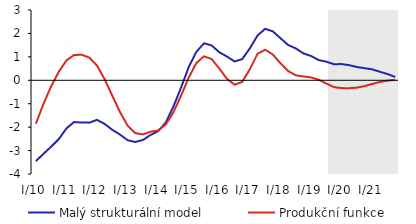
| Category | Malý strukturální model | Produkční funkce |
|---|---|---|
| I/10 | -3.452 | -1.854 |
| II | -3.138 | -1.006 |
| III | -2.836 | -0.26 |
| IV | -2.513 | 0.362 |
| I/11 | -2.056 | 0.846 |
| II | -1.783 | 1.079 |
| III | -1.803 | 1.091 |
| IV | -1.808 | 0.967 |
| I/12 | -1.689 | 0.626 |
| II | -1.862 | 0.045 |
| III | -2.114 | -0.658 |
| IV | -2.315 | -1.35 |
| I/13 | -2.556 | -1.934 |
| II | -2.635 | -2.253 |
| III | -2.55 | -2.312 |
| IV | -2.335 | -2.195 |
| I/14 | -2.171 | -2.142 |
| II | -1.803 | -1.882 |
| III | -1.118 | -1.36 |
| IV | -0.307 | -0.656 |
| I/15 | 0.567 | 0.116 |
| II | 1.214 | 0.74 |
| III | 1.581 | 1.023 |
| IV | 1.485 | 0.904 |
| I/16 | 1.196 | 0.502 |
| II | 1.013 | 0.061 |
| III | 0.803 | -0.19 |
| IV | 0.905 | -0.067 |
| I/17 | 1.367 | 0.478 |
| II | 1.913 | 1.132 |
| III | 2.198 | 1.306 |
| IV | 2.087 | 1.1 |
| I/18 | 1.796 | 0.725 |
| II | 1.506 | 0.396 |
| III | 1.361 | 0.212 |
| IV | 1.146 | 0.164 |
| I/19 | 1.036 | 0.121 |
| II | 0.862 | 0.025 |
| III | 0.794 | -0.138 |
| IV | 0.687 | -0.293 |
| I/20 | 0.692 | -0.334 |
| II | 0.645 | -0.338 |
| III | 0.566 | -0.313 |
| IV | 0.517 | -0.248 |
| I/21 | 0.466 | -0.157 |
| II | 0.363 | -0.073 |
| III | 0.265 | -0.016 |
| IV | 0.142 | 0.021 |